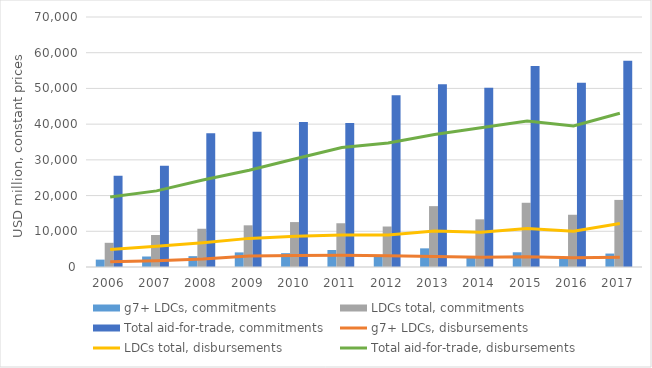
| Category | g7+ LDCs, commitments | LDCs total, commitments | Total aid-for-trade, commitments |
|---|---|---|---|
| 2006.0 | 2066.255 | 6775.952 | 25541.419 |
| 2007.0 | 2941.04 | 8956.996 | 28321.528 |
| 2008.0 | 3035.972 | 10710.466 | 37460.93 |
| 2009.0 | 4090.898 | 11668.996 | 37851.523 |
| 2010.0 | 3873.104 | 12578.175 | 40599.119 |
| 2011.0 | 4753.678 | 12249.139 | 40313.274 |
| 2012.0 | 3298.591 | 11338.294 | 48097.406 |
| 2013.0 | 5223.113 | 17040.419 | 51177.891 |
| 2014.0 | 3088.626 | 13343.326 | 50159.112 |
| 2015.0 | 4120.095 | 17984.41 | 56268.742 |
| 2016.0 | 2643.721 | 14627.804 | 51587.715 |
| 2017.0 | 3762.739 | 18786.5 | 57759.842 |